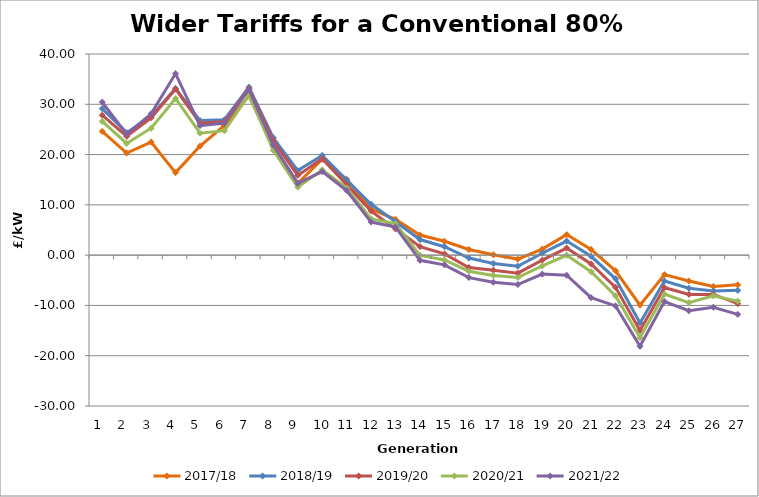
| Category | 2017/18 | 2018/19 | 2019/20 | 2020/21 | 2021/22 |
|---|---|---|---|---|---|
| 1.0 | 24.606 | 29.148 | 27.841 | 26.596 | 30.411 |
| 2.0 | 20.312 | 24.362 | 23.619 | 22.218 | 24.08 |
| 3.0 | 22.485 | 27.605 | 27.309 | 25.238 | 28.102 |
| 4.0 | 16.412 | 33.174 | 33.04 | 31.149 | 36.11 |
| 5.0 | 21.69 | 26.769 | 26.255 | 24.252 | 25.756 |
| 6.0 | 25.786 | 26.932 | 26.527 | 24.753 | 26.276 |
| 7.0 | 31.67 | 33.41 | 33.165 | 31.822 | 32.954 |
| 8.0 | 21.537 | 23.329 | 22.75 | 20.835 | 21.911 |
| 9.0 | 14.297 | 16.811 | 15.86 | 13.532 | 14.262 |
| 10.0 | 19.069 | 19.827 | 19.16 | 16.979 | 16.621 |
| 11.0 | 15.076 | 14.928 | 14.02 | 13.367 | 12.863 |
| 12.0 | 9.181 | 10.123 | 8.761 | 7.216 | 6.578 |
| 13.0 | 7.123 | 6.631 | 5.22 | 6.268 | 5.582 |
| 14.0 | 3.992 | 3.104 | 1.674 | -0.061 | -1.029 |
| 15.0 | 2.763 | 1.681 | 0.262 | -0.964 | -1.929 |
| 16.0 | 1.131 | -0.571 | -2.454 | -3.198 | -4.468 |
| 17.0 | 0.072 | -1.651 | -3.014 | -4.065 | -5.379 |
| 18.0 | -0.783 | -2.2 | -3.579 | -4.442 | -5.843 |
| 19.0 | 1.198 | 0.373 | -0.989 | -2.142 | -3.762 |
| 20.0 | 4.087 | 2.801 | 1.409 | -0.026 | -4 |
| 21.0 | 1.144 | -0.23 | -1.75 | -3.301 | -8.448 |
| 22.0 | -3.111 | -4.7 | -6.399 | -8.109 | -10.096 |
| 23.0 | -9.958 | -13.473 | -14.976 | -16.388 | -18.129 |
| 24.0 | -3.87 | -5.138 | -6.427 | -7.755 | -9.243 |
| 25.0 | -5.142 | -6.59 | -7.805 | -9.441 | -11.051 |
| 26.0 | -6.234 | -7.147 | -7.82 | -8.107 | -10.377 |
| 27.0 | -5.9 | -6.988 | -9.657 | -9.154 | -11.777 |